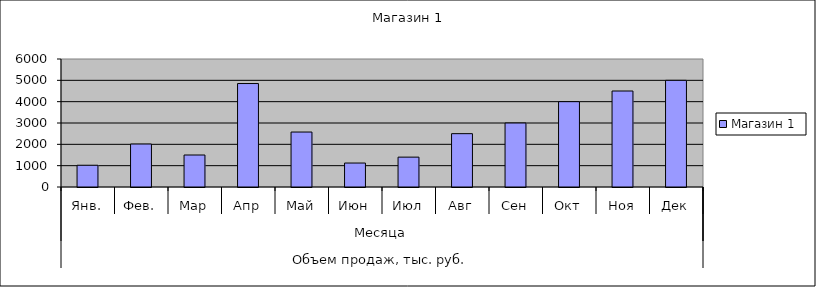
| Category | Магазин 1 |
|---|---|
| 0 | 1020 |
| 1 | 2015 |
| 2 | 1500 |
| 3 | 4850 |
| 4 | 2576 |
| 5 | 1123 |
| 6 | 1400 |
| 7 | 2500 |
| 8 | 3000 |
| 9 | 4000 |
| 10 | 4500 |
| 11 | 5000 |